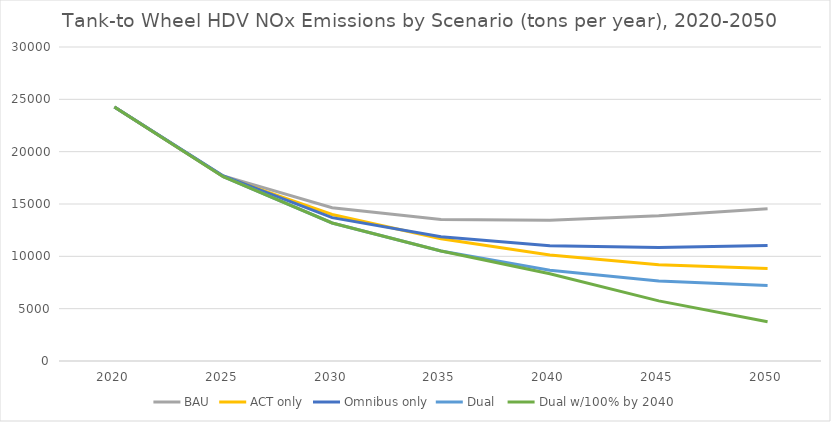
| Category | BAU | ACT only | Omnibus only | Dual  | Dual w/100% by 2040 |
|---|---|---|---|---|---|
| 2020.0 | 24269.542 | 24269.542 | 24269.542 | 24269.542 | 24269.542 |
| 2025.0 | 17679.519 | 17608.735 | 17679.519 | 17608.735 | 17608.735 |
| 2030.0 | 14640.833 | 14000.053 | 13694.361 | 13187.795 | 13187.795 |
| 2035.0 | 13527.06 | 11684.743 | 11867.231 | 10510.269 | 10510.269 |
| 2040.0 | 13458.425 | 10120.469 | 11016.392 | 8665.488 | 8336.261 |
| 2045.0 | 13874.766 | 9200.159 | 10849.466 | 7648.336 | 5744.969 |
| 2050.0 | 14538.66 | 8836.954 | 11046.816 | 7215.561 | 3752.506 |